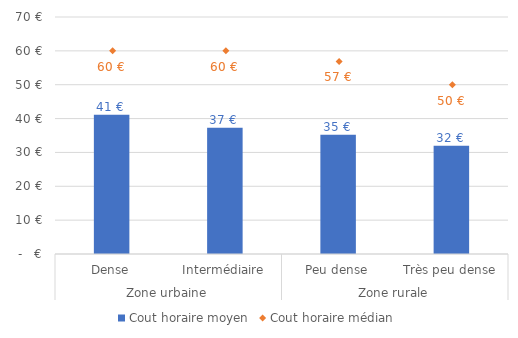
| Category | Cout horaire moyen |
|---|---|
| 0 | 41.139 |
| 1 | 37.303 |
| 2 | 35.232 |
| 3 | 31.943 |